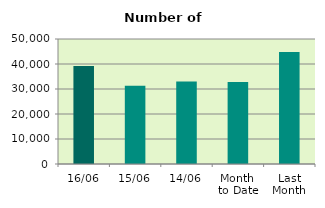
| Category | Series 0 |
|---|---|
| 16/06 | 39198 |
| 15/06 | 31326 |
| 14/06 | 33002 |
| Month 
to Date | 32823.333 |
| Last
Month | 44751.81 |